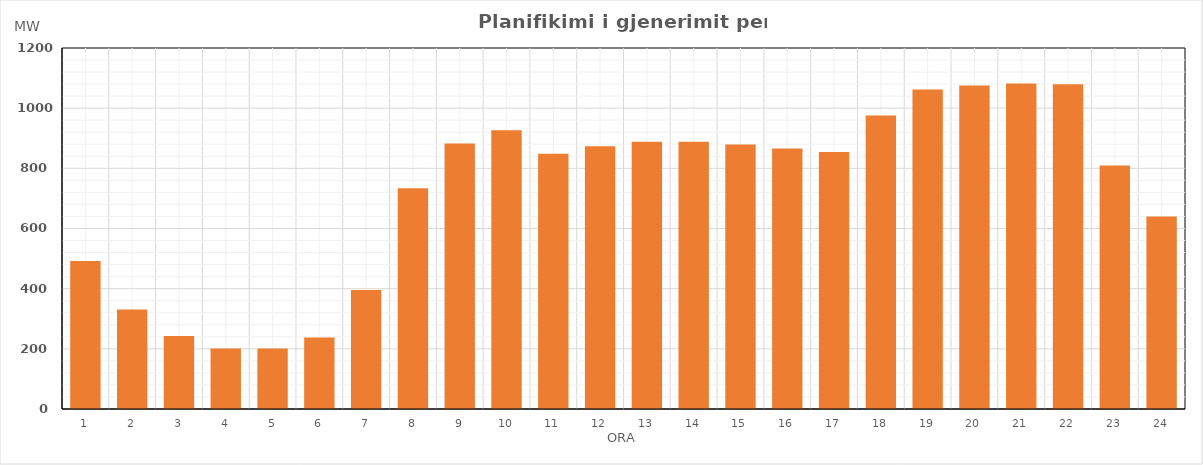
| Category | Max (MW) |
|---|---|
| 0 | 491.821 |
| 1 | 330.712 |
| 2 | 243.046 |
| 3 | 200.842 |
| 4 | 200.796 |
| 5 | 237.934 |
| 6 | 395.855 |
| 7 | 734.208 |
| 8 | 882.279 |
| 9 | 927 |
| 10 | 848.072 |
| 11 | 873.32 |
| 12 | 888.284 |
| 13 | 888 |
| 14 | 879.277 |
| 15 | 866.159 |
| 16 | 854.021 |
| 17 | 975.688 |
| 18 | 1061.693 |
| 19 | 1075.683 |
| 20 | 1081.853 |
| 21 | 1079.897 |
| 22 | 809.558 |
| 23 | 639.711 |